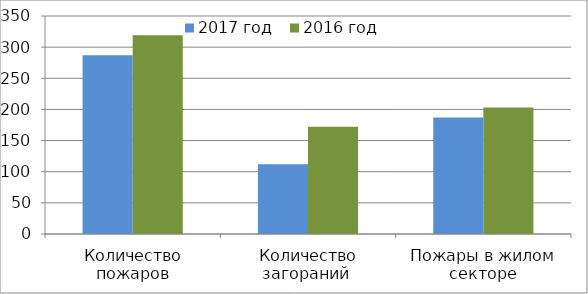
| Category | 2017 год | 2016 год |
|---|---|---|
| Количество пожаров | 287 | 319 |
| Количество загораний  | 112 | 172 |
| Пожары в жилом секторе | 187 | 203 |